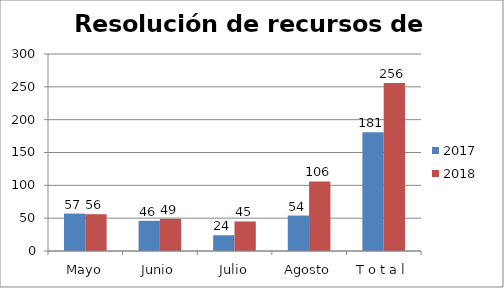
| Category | 2017 | 2018 |
|---|---|---|
| Mayo | 57 | 56 |
| Junio | 46 | 49 |
| Julio | 24 | 45 |
| Agosto | 54 | 106 |
| T o t a l | 181 | 256 |